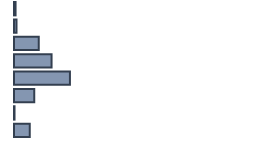
| Category | Percentatge |
|---|---|
| 0 | 0.652 |
| 1 | 1.043 |
| 2 | 10.348 |
| 3 | 15.652 |
| 4 | 23.304 |
| 5 | 8.435 |
| 6 | 0.217 |
| 7 | 6.609 |